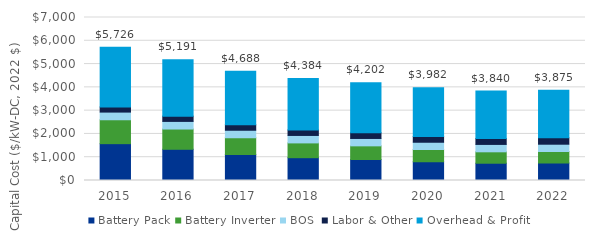
| Category | Battery Pack | Battery Inverter | BOS | Labor & Other | Overhead & Profit |
|---|---|---|---|---|---|
| 2015.0 | 1582.449 | 1026.187 | 328.95 | 220.117 | 2568.739 |
| 2016.0 | 1340.899 | 869.547 | 327.22 | 225.713 | 2427.157 |
| 2017.0 | 1115.606 | 723.449 | 323.49 | 230.782 | 2294.394 |
| 2018.0 | 979.437 | 635.146 | 320.11 | 235.917 | 2213.279 |
| 2019.0 | 902.846 | 585.478 | 317.02 | 242.445 | 2154.558 |
| 2020.0 | 805.806 | 522.55 | 315.47 | 247.693 | 2090.198 |
| 2021.0 | 741.93 | 490.466 | 316.85 | 253.806 | 2037.295 |
| 2022.0 | 751.141 | 493.869 | 313.41 | 274.844 | 2041.782 |